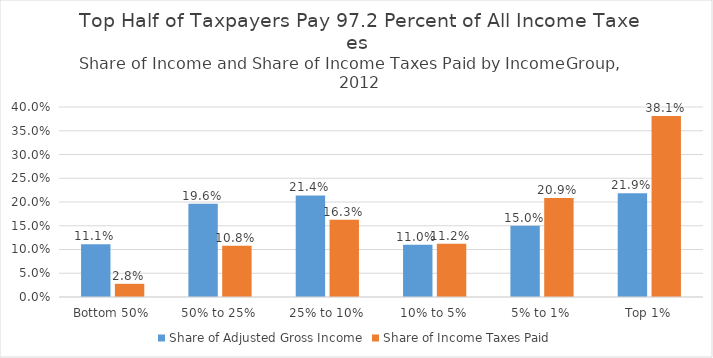
| Category | Share of Adjusted Gross Income | Share of Income Taxes Paid |
|---|---|---|
| Bottom 50% | 0.111 | 0.028 |
| 50% to 25% | 0.196 | 0.108 |
| 25% to 10% | 0.214 | 0.163 |
| 10% to 5% | 0.11 | 0.112 |
| 5% to 1% | 0.15 | 0.209 |
| Top 1% | 0.219 | 0.381 |